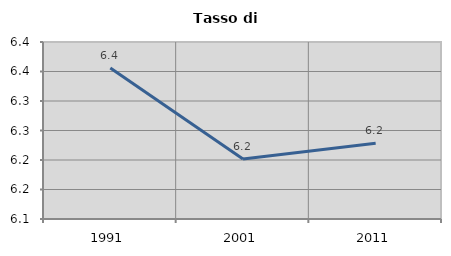
| Category | Tasso di disoccupazione   |
|---|---|
| 1991.0 | 6.356 |
| 2001.0 | 6.202 |
| 2011.0 | 6.228 |